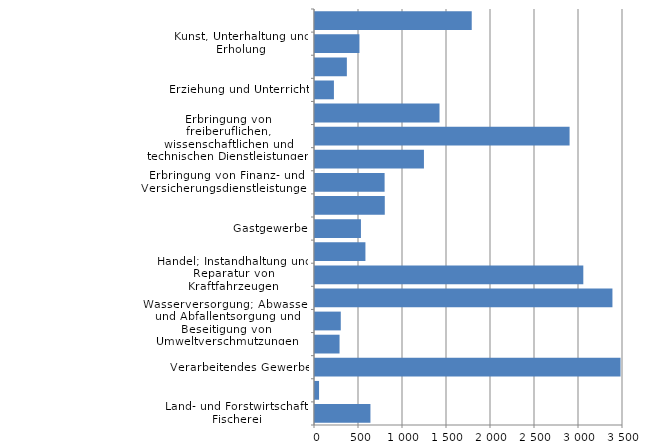
| Category | Series 0 |
|---|---|
| Land- und Forstwirtschaft, Fischerei | 630 |
| Bergbau und Gewinnung von Steinen und Erden | 46 |
| Verarbeitendes Gewerbe | 3472 |
| Energieversorgung | 279 |
| Wasserversorgung; Abwasser- und Abfallentsorgung und Beseitigung von Umweltverschmutzungen | 293 |
| Baugewerbe | 3380 |
| Handel; Instandhaltung und Reparatur von Kraftfahrzeugen | 3049 |
| Verkehr und Lagerei | 573 |
| Gastgewerbe | 522 |
| Information und Kommunikation | 793 |
| Erbringung von Finanz- und Versicherungsdienstleistungen | 791 |
| Grundstücks- und Wohnungswesen | 1238 |
| Erbringung von freiberuflichen, wissenschaftlichen und technischen Dienstleistungen | 2893 |
| Erbringung von sonstigen wirtschaftlichen Dienstleistungen | 1415 |
| Erziehung und Unterricht | 215 |
| Gesundheits- und Sozialwesen | 362 |
| Kunst, Unterhaltung und Erholung | 505 |
| Erbringung von sonstigen Dienstleistungen | 1781 |